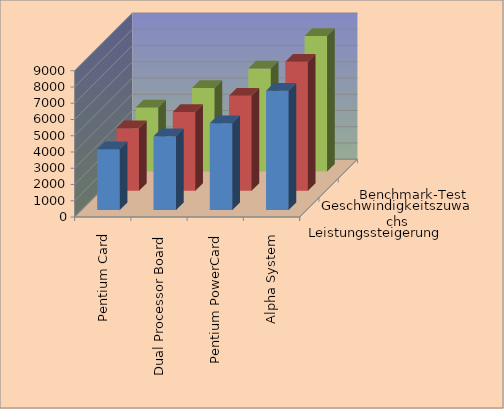
| Category | Leistungssteigerung | Geschwindigkeitszuwachs | Benchmark-Test |
|---|---|---|---|
| Pentium Card | 3750 | 3850 | 3950 |
| Dual Processor Board | 4550 | 4850 | 5150 |
| Pentium PowerCard | 5350 | 5850 | 6350 |
| Alpha System | 7350 | 7950 | 8350 |